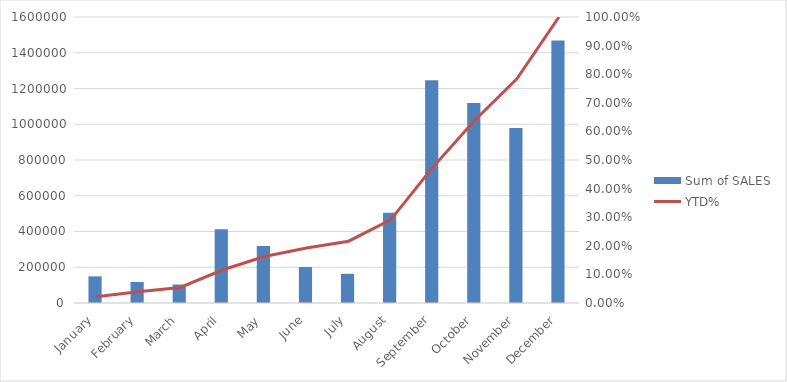
| Category | 2015 - Sum of SALES |
|---|---|
| January | 148974 |
| February | 117520 |
| March | 103332 |
| April | 412722 |
| May | 318824 |
| June | 201099 |
| July | 163269 |
| August | 505220 |
| September | 1245609 |
| October | 1119150 |
| November | 979177 |
| December | 1468002 |